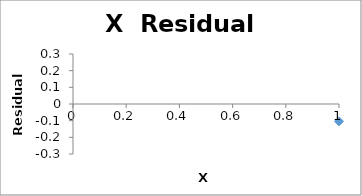
| Category | Series 0 |
|---|---|
| 0 | -0.104 |
| 1 | 0.001 |
| 2 | 0.166 |
| 3 | 0.092 |
| 4 | 0.079 |
| 5 | -0.273 |
| 6 | -0.165 |
| 7 | 0.204 |